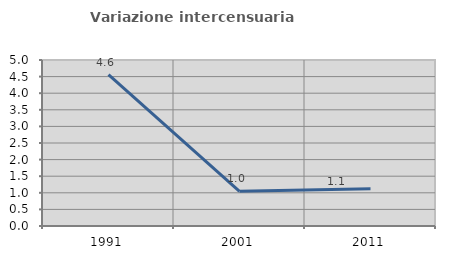
| Category | Variazione intercensuaria annua |
|---|---|
| 1991.0 | 4.558 |
| 2001.0 | 1.045 |
| 2011.0 | 1.124 |